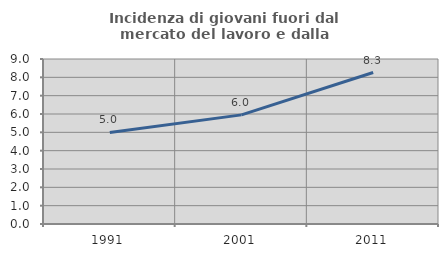
| Category | Incidenza di giovani fuori dal mercato del lavoro e dalla formazione  |
|---|---|
| 1991.0 | 4.991 |
| 2001.0 | 5.952 |
| 2011.0 | 8.263 |